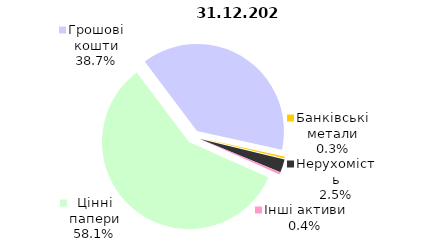
| Category | 31.12.2020 |
|---|---|
| Цінні папери | 2050.228 |
| Грошові кошти | 1366.312 |
| Банківські метали | 11.009 |
| Нерухомість | 87.027 |
| Інші активи | 15.358 |